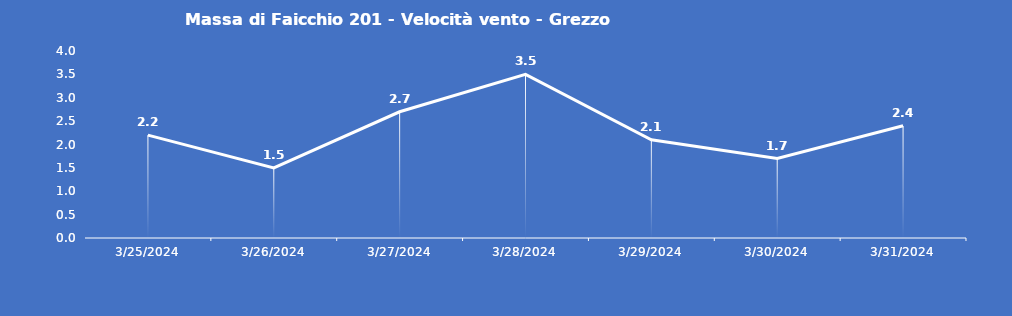
| Category | Massa di Faicchio 201 - Velocità vento - Grezzo (m/s) |
|---|---|
| 3/25/24 | 2.2 |
| 3/26/24 | 1.5 |
| 3/27/24 | 2.7 |
| 3/28/24 | 3.5 |
| 3/29/24 | 2.1 |
| 3/30/24 | 1.7 |
| 3/31/24 | 2.4 |